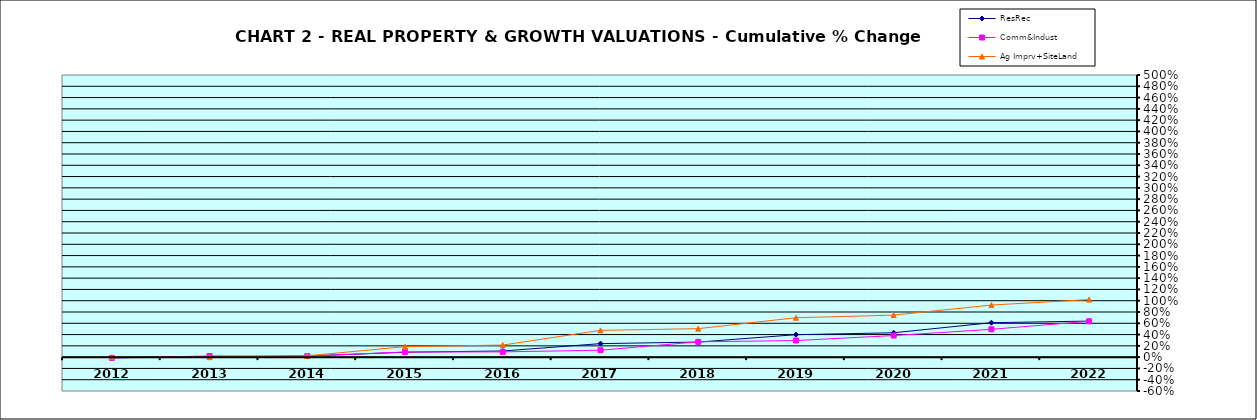
| Category | ResRec | Comm&Indust | Ag Imprv+SiteLand |
|---|---|---|---|
| 2012.0 | -0.012 | -0.014 | 0 |
| 2013.0 | 0.005 | 0.02 | 0 |
| 2014.0 | 0.019 | 0.02 | 0.024 |
| 2015.0 | 0.087 | 0.091 | 0.186 |
| 2016.0 | 0.109 | 0.093 | 0.214 |
| 2017.0 | 0.239 | 0.122 | 0.474 |
| 2018.0 | 0.267 | 0.271 | 0.505 |
| 2019.0 | 0.398 | 0.295 | 0.699 |
| 2020.0 | 0.432 | 0.382 | 0.745 |
| 2021.0 | 0.61 | 0.493 | 0.923 |
| 2022.0 | 0.639 | 0.635 | 1.02 |